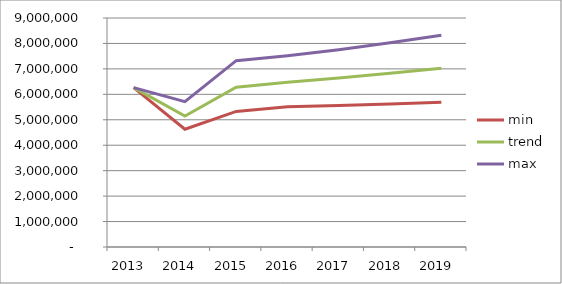
| Category |  min  |  trend  |  max  |
|---|---|---|---|
| 2013.0 | 6262232.356 | 6262232.356 | 6262232.356 |
| 2014.0 | 4628131.053 | 5145657.499 | 5715279.167 |
| 2015.0 | 5329433.669 | 6280559.34 | 7322340.785 |
| 2016.0 | 5510309.448 | 6476863.36 | 7518651.913 |
| 2017.0 | 5558268.395 | 6640778.57 | 7749020.87 |
| 2018.0 | 5624703.051 | 6829701.153 | 8024264.276 |
| 2019.0 | 5690477.189 | 7022251.278 | 8318683.093 |